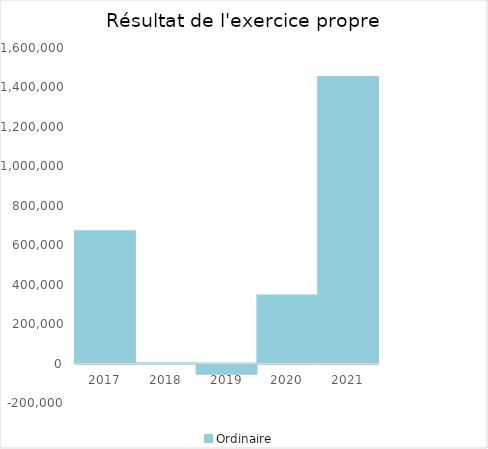
| Category |   | Ordinaire |    |
|---|---|---|---|
| 2017.0 |  | 670438.97 |  |
| 2018.0 |  | 1291.15 |  |
| 2019.0 |  | -49924.62 |  |
| 2020.0 |  | 345611.68 |  |
| 2021.0 |  | 1452875.73 |  |